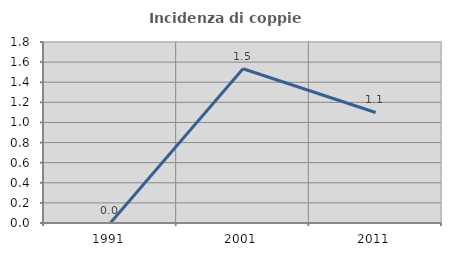
| Category | Incidenza di coppie miste |
|---|---|
| 1991.0 | 0 |
| 2001.0 | 1.534 |
| 2011.0 | 1.099 |